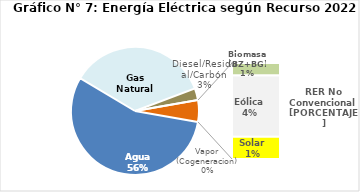
| Category | Series 0 |
|---|---|
| Agua | 2738.25 |
| Gas Natural | 1751.384 |
| Diesel/Residual/Carbón | 146.406 |
| Vapor (Cogeneracion) | 0.131 |
| Biomasa (BZ+BG) | 35.155 |
| Eólica | 171.865 |
| Solar | 62.219 |